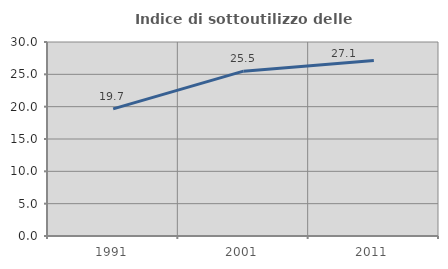
| Category | Indice di sottoutilizzo delle abitazioni  |
|---|---|
| 1991.0 | 19.651 |
| 2001.0 | 25.49 |
| 2011.0 | 27.13 |